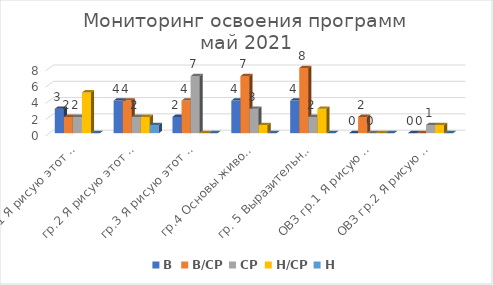
| Category | В | В/СР | СР | Н/СР | Н |
|---|---|---|---|---|---|
| гр.1 Я рисую этот мир 1 | 3 | 2 | 2 | 5 | 0 |
| гр.2 Я рисую этот мир 2 | 4 | 4 | 2 | 2 | 1 |
| гр.3 Я рисую этот мир 3 | 2 | 4 | 7 | 0 | 0 |
| гр.4 Основы живописи и рисунка | 4 | 7 | 3 | 1 | 0 |
| гр. 5 Выразительные возможности живописи и рисунка | 4 | 8 | 2 | 3 | 0 |
| ОВЗ гр.1 Я рисую этот мир | 0 | 2 | 0 | 0 | 0 |
| ОВЗ гр.2 Я рисую этот мир | 0 | 0 | 1 | 1 | 0 |